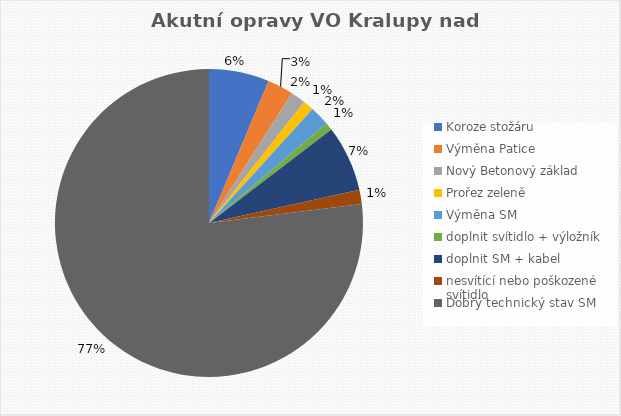
| Category | Akutní opravy SM |
|---|---|
| Koroze stožáru | 158 |
| Výměna Patice | 68 |
| Nový Betonový základ | 39 |
| Prořez zeleně | 28 |
| Výměna SM | 52 |
| doplnit svítidlo + výložník | 20 |
| doplnit SM + kabel | 173 |
| nesvítící nebo poškozené svítidlo | 37 |
| Dobrý technický stav SM | 1922 |